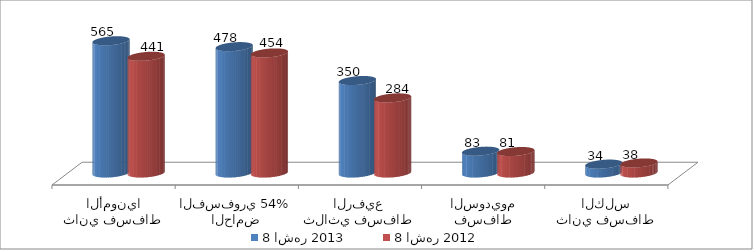
| Category | 8 اشهر 2013 | 8 اشهر 2012 |
|---|---|---|
| ثاني فسفاط الأمونيا | 565.434 | 441.328 |
| الحامض الفسفوري 54% | 477.806 | 454.029 |
| ثلاثي فسفاط الرفيع | 349.668 | 283.97 |
| فسفاط السوديوم | 82.514 | 81.18 |
| ثاني فسفاط الكلس | 33.59 | 37.91 |